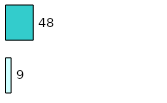
| Category | Series 0 | Series 1 |
|---|---|---|
| 0 | 9 | 48 |